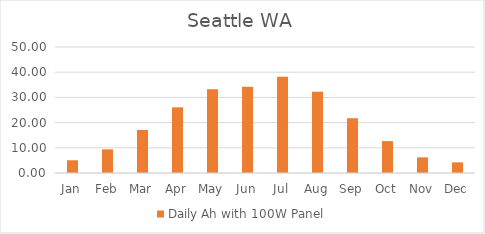
| Category | Daily Ah with 100W Panel |
|---|---|
| Jan | 5.062 |
| Feb | 9.38 |
| Mar | 17.072 |
| Apr | 26.055 |
| May | 33.251 |
| Jun | 34.243 |
| Jul | 38.213 |
| Aug | 32.258 |
| Sep | 21.737 |
| Oct | 12.655 |
| Nov | 6.203 |
| Dec | 4.218 |